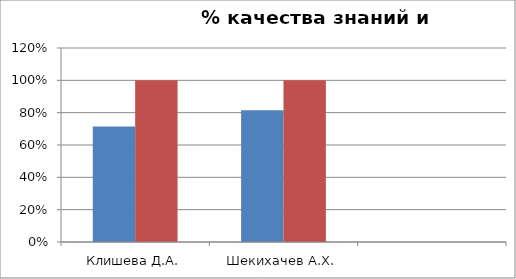
| Category | Series 0 | 2 |
|---|---|---|
| Клишева Д.А. | 0.714 | 1 |
| Шекихачев А.Х. | 0.815 | 1 |